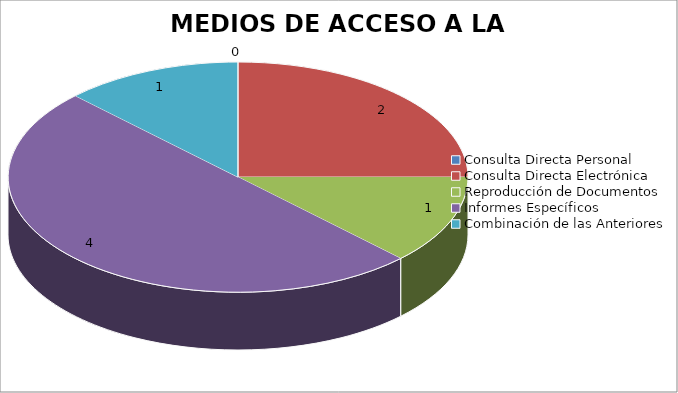
| Category | MEDIOS DE ACCESO A LA INFORMACIÓN |
|---|---|
| 0 | 0 |
| 1 | 2 |
| 2 | 1 |
| 3 | 4 |
| 4 | 1 |